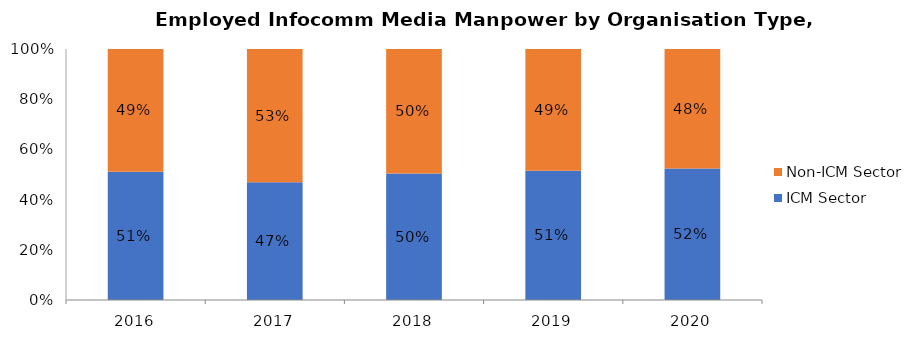
| Category | ICM Sector | Non-ICM Sector |
|---|---|---|
| 2016.0 | 0.511 | 0.489 |
| 2017.0 | 0.47 | 0.53 |
| 2018.0 | 0.504 | 0.496 |
| 2019.0 | 0.515 | 0.485 |
| 2020.0 | 0.524 | 0.476 |